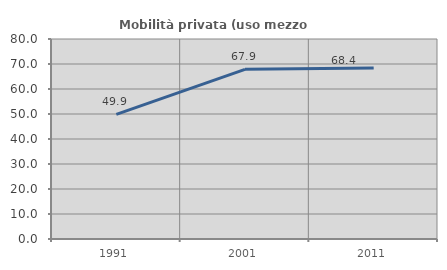
| Category | Mobilità privata (uso mezzo privato) |
|---|---|
| 1991.0 | 49.868 |
| 2001.0 | 67.853 |
| 2011.0 | 68.44 |